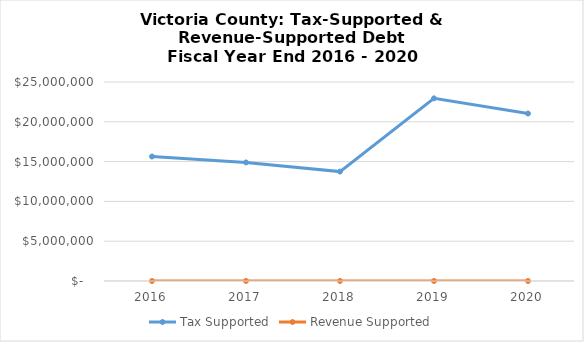
| Category | Tax Supported | Revenue Supported |
|---|---|---|
| 2016.0 | 15638874 | 0 |
| 2017.0 | 14893415 | 0 |
| 2018.0 | 13744665 | 0 |
| 2019.0 | 22947447 | 0 |
| 2020.0 | 21042414 | 0 |